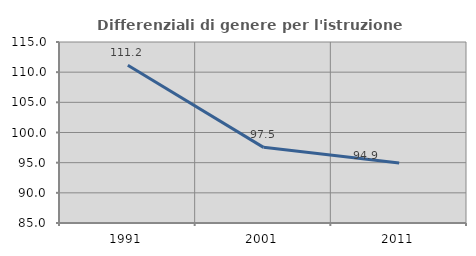
| Category | Differenziali di genere per l'istruzione superiore |
|---|---|
| 1991.0 | 111.159 |
| 2001.0 | 97.538 |
| 2011.0 | 94.948 |